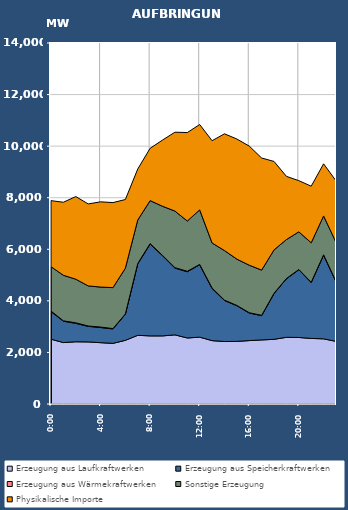
| Category | Erzeugung aus Laufkraftwerken | Erzeugung aus Speicherkraftwerken | Erzeugung aus Wärmekraftwerken | Sonstige Erzeugung | Physikalische Importe |
|---|---|---|---|---|---|
| 2007-01-17 | 2512.583 | 1067.272 | 27.912 | 1719.06 | 2559.598 |
| 2007-01-17 01:00:00 | 2382.426 | 829.979 | 12.712 | 1766.956 | 2832.09 |
| 2007-01-17 02:00:00 | 2413.416 | 713.084 | 22.256 | 1690.523 | 3206.202 |
| 2007-01-17 03:00:00 | 2407.812 | 604.327 | 12.772 | 1555.686 | 3178.678 |
| 2007-01-17 04:00:00 | 2378.116 | 587.81 | 18.154 | 1550.388 | 3305.858 |
| 2007-01-17 05:00:00 | 2350.67 | 560.771 | 13.3 | 1588.556 | 3297.946 |
| 2007-01-17 06:00:00 | 2468.738 | 1009.795 | 12.146 | 1774.074 | 2665.306 |
| 2007-01-17 07:00:00 | 2663.373 | 2773.057 | 12.456 | 1685.738 | 1978.29 |
| 2007-01-17 08:00:00 | 2641.304 | 3558.182 | 22.04 | 1665.717 | 2029.499 |
| 2007-01-17 09:00:00 | 2641.288 | 3109.275 | 11.943 | 1905.433 | 2567.696 |
| 2007-01-17 10:00:00 | 2681.179 | 2590.691 | 16.323 | 2194.546 | 3058.388 |
| 2007-01-17 11:00:00 | 2560.473 | 2567.975 | 18.014 | 1950.947 | 3429.337 |
| 2007-01-17 12:00:00 | 2591.807 | 2809.97 | 12.586 | 2113.306 | 3310.639 |
| 2007-01-17 13:00:00 | 2457.528 | 2020.737 | 20.227 | 1746.056 | 3966.499 |
| 2007-01-17 14:00:00 | 2422.458 | 1592.966 | 13.096 | 1921.729 | 4528.322 |
| 2007-01-17 15:00:00 | 2427.927 | 1383.257 | 12.906 | 1794.888 | 4658.048 |
| 2007-01-17 16:00:00 | 2459.231 | 1068.332 | 12.025 | 1843.041 | 4618.87 |
| 2007-01-17 17:00:00 | 2484.467 | 942.759 | 11.33 | 1754.322 | 4347.628 |
| 2007-01-17 18:00:00 | 2508.107 | 1775.053 | 11.577 | 1682.532 | 3429.034 |
| 2007-01-17 19:00:00 | 2586.425 | 2269.059 | 11.319 | 1509.731 | 2452.061 |
| 2007-01-17 20:00:00 | 2579.555 | 2626.317 | 11.654 | 1460.095 | 1983.414 |
| 2007-01-17 21:00:00 | 2542.835 | 2167.736 | 11.576 | 1529.009 | 2196.29 |
| 2007-01-17 22:00:00 | 2527.058 | 3247.484 | 12.619 | 1506.723 | 2020.802 |
| 2007-01-17 23:00:00 | 2429.213 | 2312.9 | 12.541 | 1517.893 | 2384.638 |